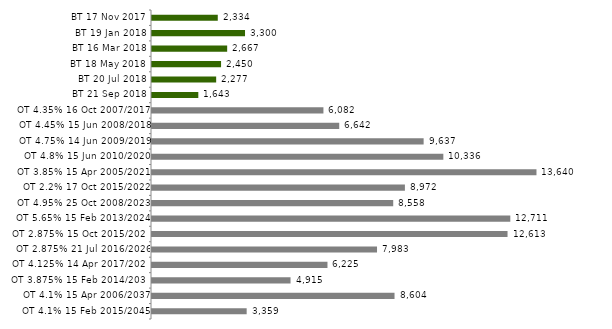
| Category | Series 0 |
|---|---|
| BT 17 Nov 2017 | 2333.545 |
| BT 19 Jan 2018 | 3300.288 |
| BT 16 Mar 2018 | 2666.751 |
| BT 18 May 2018 | 2450.013 |
| BT 20 Jul 2018 | 2276.606 |
| BT 21 Sep 2018 | 1642.96 |
| OT 4.35% 16 Oct 2007/2017 | 6081.646 |
| OT 4.45% 15 Jun 2008/2018 | 6642.44 |
| OT 4.75% 14 Jun 2009/2019 | 9636.58 |
| OT 4.8% 15 Jun 2010/2020 | 10335.658 |
| OT 3.85% 15 Apr 2005/2021 | 13639.958 |
| OT 2.2% 17 Oct 2015/2022 | 8972.398 |
| OT 4.95% 25 Oct 2008/2023 | 8557.734 |
| OT 5.65% 15 Feb 2013/2024 | 12711.355 |
| OT 2.875% 15 Oct 2015/2025 | 12613.263 |
| OT 2.875% 21 Jul 2016/2026 | 7982.982 |
| OT 4.125% 14 Apr 2017/2027 | 6225.003 |
| OT 3.875% 15 Feb 2014/2030 | 4914.902 |
| OT 4.1% 15 Apr 2006/2037 | 8604.325 |
| OT 4.1% 15 Feb 2015/2045 | 3358.684 |